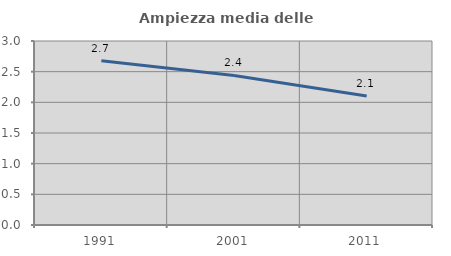
| Category | Ampiezza media delle famiglie |
|---|---|
| 1991.0 | 2.677 |
| 2001.0 | 2.438 |
| 2011.0 | 2.102 |